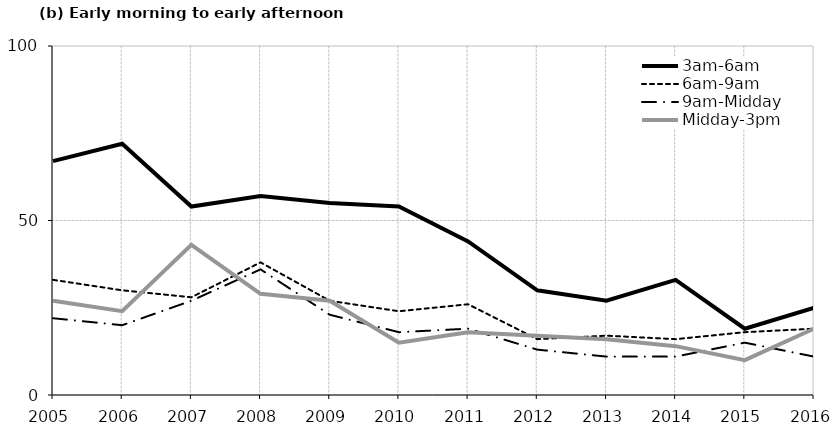
| Category | 3am-6am | 6am-9am | 9am-Midday | Midday-3pm |
|---|---|---|---|---|
| 2005.0 | 67 | 33 | 22 | 27 |
| 2006.0 | 72 | 30 | 20 | 24 |
| 2007.0 | 54 | 28 | 27 | 43 |
| 2008.0 | 57 | 38 | 36 | 29 |
| 2009.0 | 55 | 27 | 23 | 27 |
| 2010.0 | 54 | 24 | 18 | 15 |
| 2011.0 | 44 | 26 | 19 | 18 |
| 2012.0 | 30 | 16 | 13 | 17 |
| 2013.0 | 27 | 17 | 11 | 16 |
| 2014.0 | 33 | 16 | 11 | 14 |
| 2015.0 | 19 | 18 | 15 | 10 |
| 2016.0 | 25 | 19 | 11 | 19 |